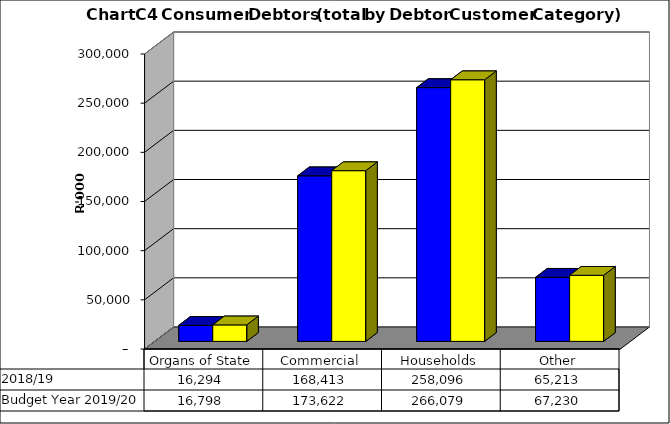
| Category |  2018/19  | Budget Year 2019/20 |
|---|---|---|
| Organs of State | 16293990.025 | 16797927.861 |
| Commercial | 168413100.508 | 173621753.101 |
| Households | 258096299.666 | 266078659.449 |
| Other | 65212786.127 | 67229676.419 |